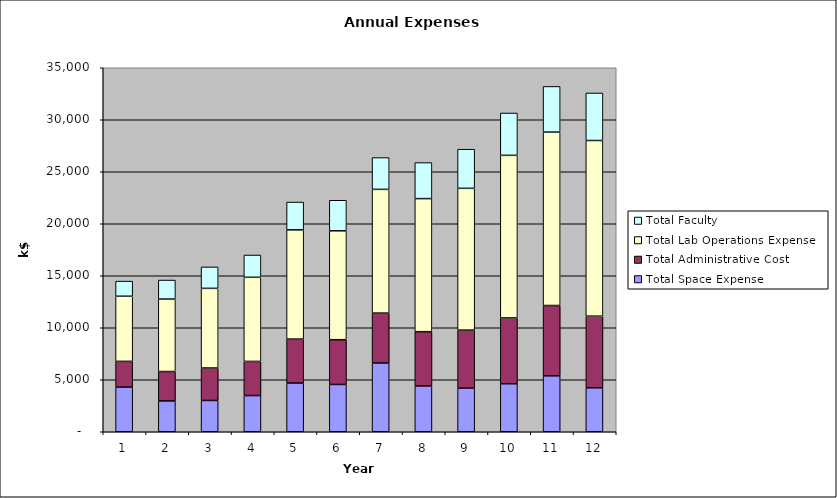
| Category | Total Space Expense | Total Administrative Cost | Total Lab Operations Expense | Total Faculty |
|---|---|---|---|---|
| 0 | 4289.953 | 2476.942 | 6263.717 | 1452.613 |
| 1 | 2966.91 | 2823.828 | 6968.756 | 1828.218 |
| 2 | 3008.647 | 3120.171 | 7660.064 | 2060.097 |
| 3 | 3479.632 | 3283.962 | 8087.912 | 2142.5 |
| 4 | 4680.938 | 4229.53 | 10503.405 | 2672.7 |
| 5 | 4547.387 | 4303.982 | 10469.684 | 2938.358 |
| 6 | 6611.124 | 4799.269 | 11895.102 | 3055.893 |
| 7 | 4405.356 | 5218.83 | 12794.16 | 3463.878 |
| 8 | 4190.779 | 5583.339 | 13632.395 | 3761.184 |
| 9 | 4616.676 | 6325.707 | 15635.871 | 4070.381 |
| 10 | 5379.139 | 6761.443 | 16671.74 | 4391.946 |
| 11 | 4226.773 | 6888.253 | 16891.107 | 4567.624 |